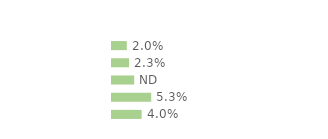
| Category | Series 0 |
|---|---|
| Communes rurales | 0.02 |
| moins de 20 000 hab. | 0.023 |
| 20 000 - 100 000 hab. | 0.03 |
| 100 000 hab. ou plus | 0.053 |
| Agglomération parisienne | 0.04 |